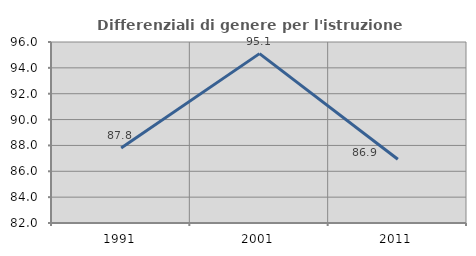
| Category | Differenziali di genere per l'istruzione superiore |
|---|---|
| 1991.0 | 87.793 |
| 2001.0 | 95.102 |
| 2011.0 | 86.935 |